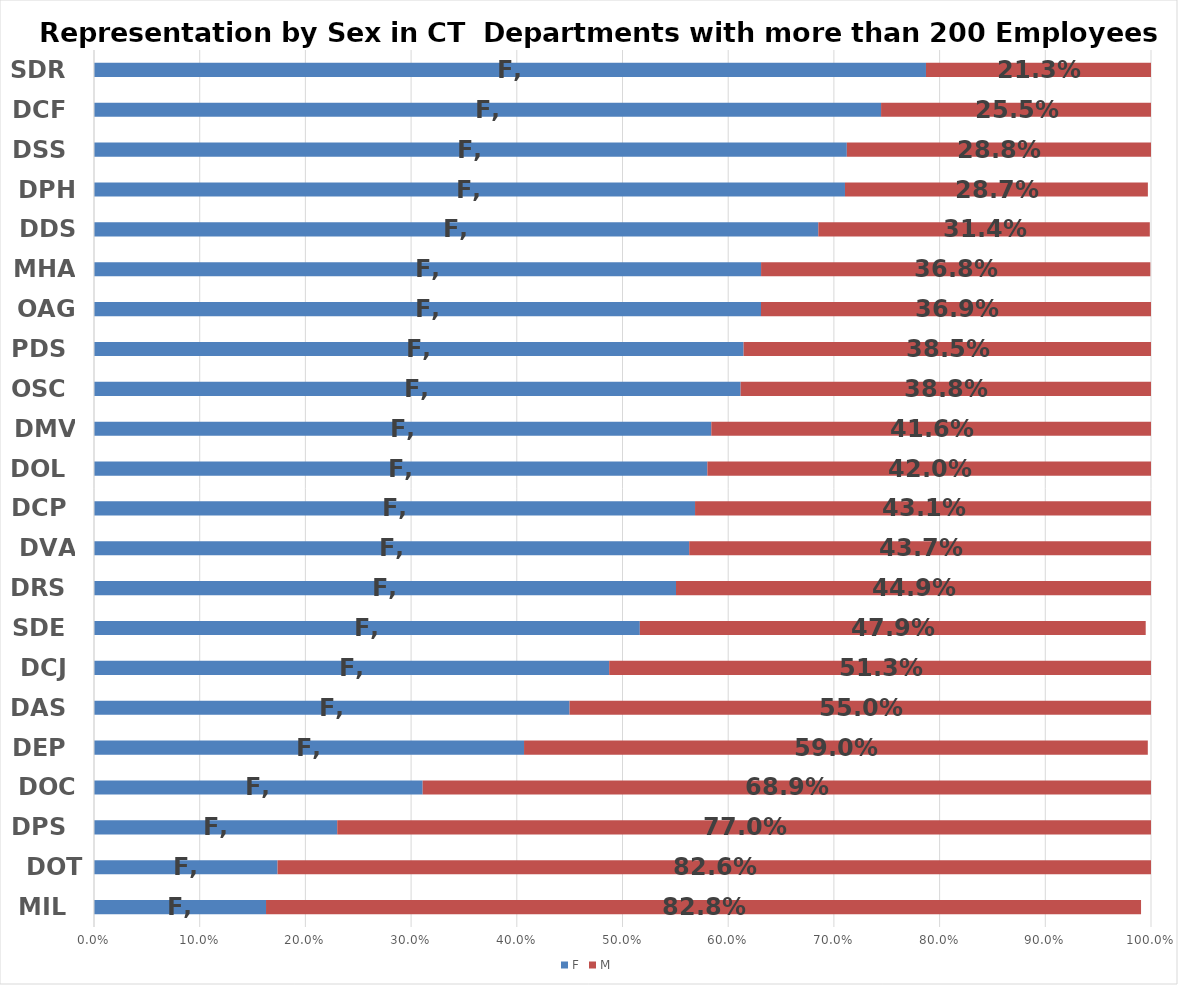
| Category | F | M |
|---|---|---|
| MIL | 0.163 | 0.828 |
| DOT | 0.174 | 0.826 |
| DPS | 0.23 | 0.77 |
| DOC | 0.311 | 0.689 |
| DEP | 0.407 | 0.59 |
| DAS | 0.45 | 0.55 |
| DCJ | 0.487 | 0.513 |
| SDE | 0.516 | 0.479 |
| DRS | 0.551 | 0.449 |
| DVA | 0.563 | 0.437 |
| DCP | 0.569 | 0.431 |
| DOL | 0.58 | 0.42 |
| DMV | 0.584 | 0.416 |
| OSC | 0.612 | 0.388 |
| PDS | 0.615 | 0.385 |
| OAG | 0.631 | 0.369 |
| MHA | 0.631 | 0.368 |
| DDS | 0.685 | 0.314 |
| DPH | 0.71 | 0.287 |
| DSS | 0.712 | 0.288 |
| DCF | 0.745 | 0.255 |
| SDR | 0.787 | 0.213 |